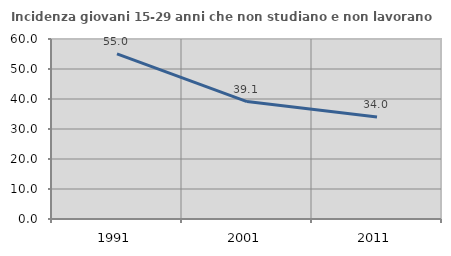
| Category | Incidenza giovani 15-29 anni che non studiano e non lavorano  |
|---|---|
| 1991.0 | 55.012 |
| 2001.0 | 39.142 |
| 2011.0 | 33.973 |